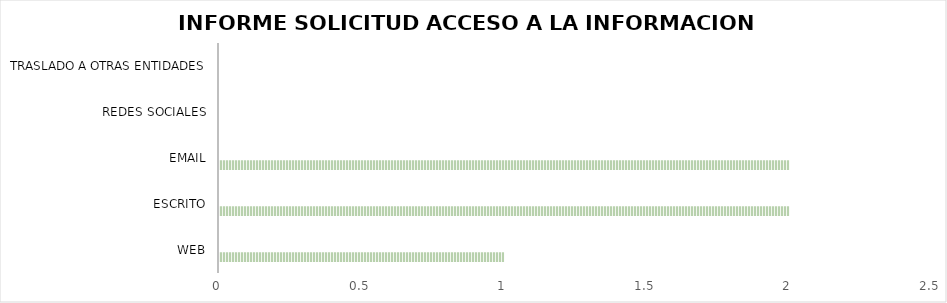
| Category | Series 1 | Series 4 |
|---|---|---|
| WEB | 1 |  |
| ESCRITO | 2 |  |
| EMAIL | 2 |  |
| REDES SOCIALES | 0 |  |
| TRASLADO A OTRAS ENTIDADES | 0 |  |